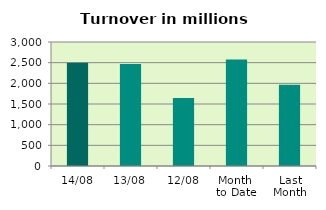
| Category | Series 0 |
|---|---|
| 14/08 | 2500.442 |
| 13/08 | 2466.005 |
| 12/08 | 1644.734 |
| Month 
to Date | 2574.83 |
| Last
Month | 1965.856 |